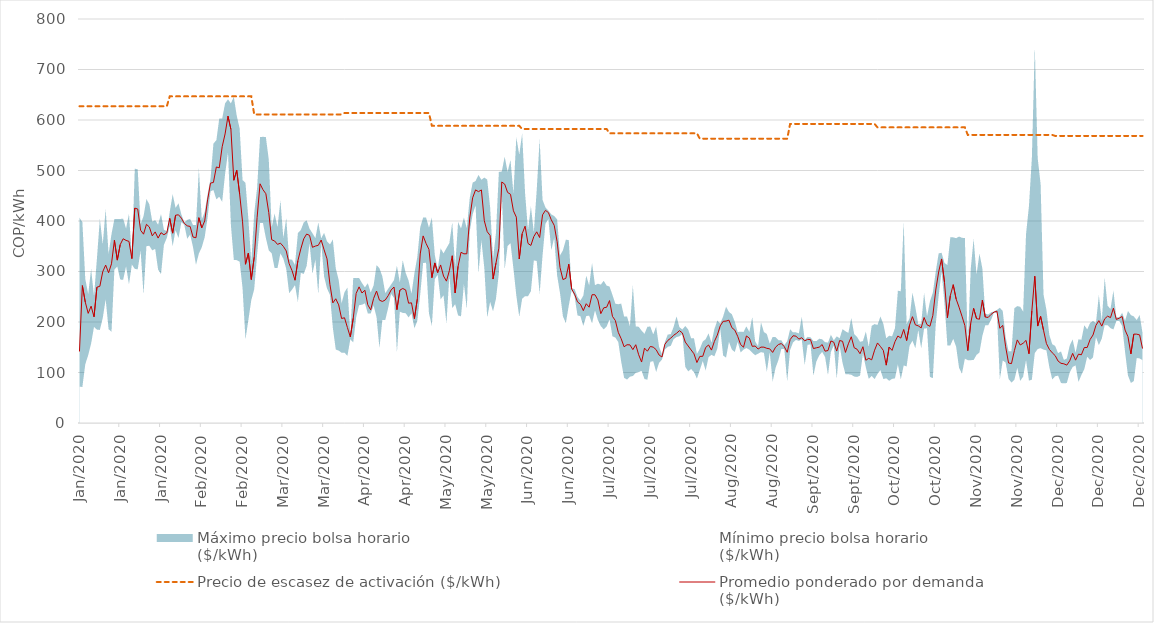
| Category | Precio de escasez de activación ($/kWh) | Promedio ponderado por demanda 
($/kWh) |
|---|---|---|
| 2020-01-01 | 627.213 | 141.655 |
| 2020-01-02 | 627.213 | 272.085 |
| 2020-01-03 | 627.213 | 239.373 |
| 2020-01-04 | 627.213 | 217.086 |
| 2020-01-05 | 627.213 | 231.37 |
| 2020-01-06 | 627.213 | 210.236 |
| 2020-01-07 | 627.213 | 268.882 |
| 2020-01-08 | 627.213 | 270.704 |
| 2020-01-09 | 627.213 | 299.661 |
| 2020-01-10 | 627.213 | 312.712 |
| 2020-01-11 | 627.213 | 297.516 |
| 2020-01-12 | 627.213 | 315.284 |
| 2020-01-13 | 627.213 | 361.729 |
| 2020-01-14 | 627.213 | 322.54 |
| 2020-01-15 | 627.213 | 353.299 |
| 2020-01-16 | 627.213 | 364.846 |
| 2020-01-17 | 627.213 | 361.555 |
| 2020-01-18 | 627.213 | 359.63 |
| 2020-01-19 | 627.213 | 325.527 |
| 2020-01-20 | 627.213 | 425.553 |
| 2020-01-21 | 627.213 | 423.751 |
| 2020-01-22 | 627.213 | 381.593 |
| 2020-01-23 | 627.213 | 373.913 |
| 2020-01-24 | 627.213 | 393.427 |
| 2020-01-25 | 627.213 | 388.112 |
| 2020-01-26 | 627.213 | 370.528 |
| 2020-01-27 | 627.213 | 378.386 |
| 2020-01-28 | 627.213 | 366.152 |
| 2020-01-29 | 627.213 | 376.867 |
| 2020-01-30 | 627.213 | 372.802 |
| 2020-01-31 | 627.213 | 376.49 |
| 2020-02-01 | 646.808 | 405.194 |
| 2020-02-02 | 646.808 | 375.973 |
| 2020-02-03 | 646.808 | 411.447 |
| 2020-02-04 | 646.808 | 412.305 |
| 2020-02-05 | 646.808 | 405.642 |
| 2020-02-06 | 646.808 | 395.253 |
| 2020-02-07 | 646.808 | 390.417 |
| 2020-02-08 | 646.808 | 389.23 |
| 2020-02-09 | 646.808 | 368.252 |
| 2020-02-10 | 646.808 | 366.878 |
| 2020-02-11 | 646.808 | 406.555 |
| 2020-02-12 | 646.808 | 386.313 |
| 2020-02-13 | 646.808 | 400.216 |
| 2020-02-14 | 646.808 | 441.826 |
| 2020-02-15 | 646.808 | 475.075 |
| 2020-02-16 | 646.808 | 476.331 |
| 2020-02-17 | 646.808 | 506.97 |
| 2020-02-18 | 646.808 | 505.279 |
| 2020-02-19 | 646.808 | 547.105 |
| 2020-02-20 | 646.808 | 572.398 |
| 2020-02-21 | 646.808 | 607.665 |
| 2020-02-22 | 646.808 | 581.477 |
| 2020-02-23 | 646.808 | 480.66 |
| 2020-02-24 | 646.808 | 500.383 |
| 2020-02-25 | 646.808 | 453.413 |
| 2020-02-26 | 646.808 | 398.446 |
| 2020-02-27 | 646.808 | 314.337 |
| 2020-02-28 | 646.808 | 336.603 |
| 2020-02-29 | 646.808 | 284.167 |
| 2020-03-01 | 610.972 | 328.336 |
| 2020-03-02 | 610.972 | 407.007 |
| 2020-03-03 | 610.972 | 473.69 |
| 2020-03-04 | 610.972 | 462.121 |
| 2020-03-05 | 610.972 | 453.989 |
| 2020-03-06 | 610.972 | 416.699 |
| 2020-03-07 | 610.972 | 362.888 |
| 2020-03-08 | 610.972 | 360.486 |
| 2020-03-09 | 610.972 | 353.698 |
| 2020-03-10 | 610.972 | 356.115 |
| 2020-03-11 | 610.972 | 349.742 |
| 2020-03-12 | 610.972 | 340.701 |
| 2020-03-13 | 610.972 | 315.329 |
| 2020-03-14 | 610.972 | 301.576 |
| 2020-03-15 | 610.972 | 282.792 |
| 2020-03-16 | 610.972 | 321.456 |
| 2020-03-17 | 610.972 | 344.68 |
| 2020-03-18 | 610.972 | 364.618 |
| 2020-03-19 | 610.972 | 374.156 |
| 2020-03-20 | 610.972 | 371.494 |
| 2020-03-21 | 610.972 | 347.905 |
| 2020-03-22 | 610.972 | 350.341 |
| 2020-03-23 | 610.972 | 351.836 |
| 2020-03-24 | 610.972 | 362.356 |
| 2020-03-25 | 610.972 | 342.828 |
| 2020-03-26 | 610.972 | 325.091 |
| 2020-03-27 | 610.972 | 274.595 |
| 2020-03-28 | 610.972 | 237.822 |
| 2020-03-29 | 610.972 | 245.986 |
| 2020-03-30 | 610.972 | 233.933 |
| 2020-03-31 | 610.972 | 206.991 |
| 2020-04-01 | 613.837 | 208.355 |
| 2020-04-02 | 613.837 | 189.05 |
| 2020-04-03 | 613.837 | 170.352 |
| 2020-04-04 | 613.837 | 207.409 |
| 2020-04-05 | 613.837 | 256.547 |
| 2020-04-06 | 613.837 | 269.583 |
| 2020-04-07 | 613.837 | 257.367 |
| 2020-04-08 | 613.837 | 262.926 |
| 2020-04-09 | 613.837 | 233.971 |
| 2020-04-10 | 613.837 | 224.045 |
| 2020-04-11 | 613.837 | 246.755 |
| 2020-04-12 | 613.837 | 261.29 |
| 2020-04-13 | 613.837 | 243.248 |
| 2020-04-14 | 613.837 | 240.67 |
| 2020-04-15 | 613.837 | 243.576 |
| 2020-04-16 | 613.837 | 252.107 |
| 2020-04-17 | 613.837 | 263.306 |
| 2020-04-18 | 613.837 | 269.279 |
| 2020-04-19 | 613.837 | 224.392 |
| 2020-04-20 | 613.837 | 262.994 |
| 2020-04-21 | 613.837 | 266.337 |
| 2020-04-22 | 613.837 | 263.512 |
| 2020-04-23 | 613.837 | 237.231 |
| 2020-04-24 | 613.837 | 237.94 |
| 2020-04-25 | 613.837 | 206.629 |
| 2020-04-26 | 613.837 | 245.4 |
| 2020-04-27 | 613.837 | 334.753 |
| 2020-04-28 | 613.837 | 370.512 |
| 2020-04-29 | 613.837 | 355.629 |
| 2020-04-30 | 613.837 | 343.69 |
| 2020-05-01 | 588.481 | 287.702 |
| 2020-05-02 | 588.481 | 316.971 |
| 2020-05-03 | 588.481 | 297.734 |
| 2020-05-04 | 588.481 | 312.993 |
| 2020-05-05 | 588.481 | 291.024 |
| 2020-05-06 | 588.481 | 280.888 |
| 2020-05-07 | 588.481 | 301.519 |
| 2020-05-08 | 588.481 | 331.157 |
| 2020-05-09 | 588.481 | 257.518 |
| 2020-05-10 | 588.481 | 310.347 |
| 2020-05-11 | 588.481 | 338.014 |
| 2020-05-12 | 588.481 | 334.973 |
| 2020-05-13 | 588.481 | 335.125 |
| 2020-05-14 | 588.481 | 405.9 |
| 2020-05-15 | 588.481 | 445.901 |
| 2020-05-16 | 588.481 | 461.627 |
| 2020-05-17 | 588.481 | 458.15 |
| 2020-05-18 | 588.481 | 461.49 |
| 2020-05-19 | 588.481 | 400.55 |
| 2020-05-20 | 588.481 | 378.798 |
| 2020-05-21 | 588.481 | 371.27 |
| 2020-05-22 | 588.481 | 285.071 |
| 2020-05-23 | 588.481 | 316.483 |
| 2020-05-24 | 588.481 | 346.121 |
| 2020-05-25 | 588.481 | 477.281 |
| 2020-05-26 | 588.481 | 473.023 |
| 2020-05-27 | 588.481 | 456.552 |
| 2020-05-28 | 588.481 | 452.903 |
| 2020-05-29 | 588.481 | 420.188 |
| 2020-05-30 | 588.481 | 407.624 |
| 2020-05-31 | 588.481 | 324.825 |
| 2020-06-01 | 582.191 | 374.86 |
| 2020-06-02 | 582.191 | 389.743 |
| 2020-06-03 | 582.191 | 355.543 |
| 2020-06-04 | 582.191 | 351.605 |
| 2020-06-05 | 582.191 | 369.216 |
| 2020-06-06 | 582.191 | 378.575 |
| 2020-06-07 | 582.191 | 367.258 |
| 2020-06-08 | 582.191 | 412.206 |
| 2020-06-09 | 582.191 | 421.041 |
| 2020-06-10 | 582.191 | 416.715 |
| 2020-06-11 | 582.191 | 402.321 |
| 2020-06-12 | 582.191 | 391.427 |
| 2020-06-13 | 582.191 | 359.245 |
| 2020-06-14 | 582.191 | 307.953 |
| 2020-06-15 | 582.191 | 284.039 |
| 2020-06-16 | 582.191 | 286.447 |
| 2020-06-17 | 582.191 | 314.437 |
| 2020-06-18 | 582.191 | 265.275 |
| 2020-06-19 | 582.191 | 255.146 |
| 2020-06-20 | 582.191 | 239.815 |
| 2020-06-21 | 582.191 | 235.059 |
| 2020-06-22 | 582.191 | 222.535 |
| 2020-06-23 | 582.191 | 236.18 |
| 2020-06-24 | 582.191 | 229.272 |
| 2020-06-25 | 582.191 | 254.037 |
| 2020-06-26 | 582.191 | 253.957 |
| 2020-06-27 | 582.191 | 243.68 |
| 2020-06-28 | 582.191 | 216.54 |
| 2020-06-29 | 582.191 | 228.038 |
| 2020-06-30 | 582.191 | 229.21 |
| 2020-07-01 | 573.611 | 242.416 |
| 2020-07-02 | 573.611 | 211.155 |
| 2020-07-03 | 573.611 | 202.792 |
| 2020-07-04 | 573.611 | 179.42 |
| 2020-07-05 | 573.611 | 166.772 |
| 2020-07-06 | 573.611 | 150.909 |
| 2020-07-07 | 573.611 | 154.98 |
| 2020-07-08 | 573.611 | 154.683 |
| 2020-07-09 | 573.611 | 145.281 |
| 2020-07-10 | 573.611 | 154.998 |
| 2020-07-11 | 573.611 | 135.186 |
| 2020-07-12 | 573.611 | 120.717 |
| 2020-07-13 | 573.611 | 148.25 |
| 2020-07-14 | 573.611 | 142.148 |
| 2020-07-15 | 573.611 | 151.556 |
| 2020-07-16 | 573.611 | 150.222 |
| 2020-07-17 | 573.611 | 145.23 |
| 2020-07-18 | 573.611 | 134.675 |
| 2020-07-19 | 573.611 | 130.675 |
| 2020-07-20 | 573.611 | 155.858 |
| 2020-07-21 | 573.611 | 163.495 |
| 2020-07-22 | 573.611 | 167.956 |
| 2020-07-23 | 573.611 | 173.707 |
| 2020-07-24 | 573.611 | 177.62 |
| 2020-07-25 | 573.611 | 182.864 |
| 2020-07-26 | 573.611 | 178.305 |
| 2020-07-27 | 573.611 | 160.288 |
| 2020-07-28 | 573.611 | 152.484 |
| 2020-07-29 | 573.611 | 144.704 |
| 2020-07-30 | 573.611 | 136.96 |
| 2020-07-31 | 573.611 | 119.77 |
| 2020-08-01 | 562.998 | 131.922 |
| 2020-08-02 | 562.998 | 131.994 |
| 2020-08-03 | 562.998 | 149.553 |
| 2020-08-04 | 562.998 | 154.463 |
| 2020-08-05 | 562.998 | 144.365 |
| 2020-08-06 | 562.998 | 161.59 |
| 2020-08-07 | 562.998 | 173.999 |
| 2020-08-08 | 562.998 | 192.289 |
| 2020-08-09 | 562.998 | 201.303 |
| 2020-08-10 | 562.998 | 201.823 |
| 2020-08-11 | 562.998 | 203.646 |
| 2020-08-12 | 562.998 | 188.768 |
| 2020-08-13 | 562.998 | 183.965 |
| 2020-08-14 | 562.998 | 171.624 |
| 2020-08-15 | 562.998 | 155.364 |
| 2020-08-16 | 562.998 | 150.102 |
| 2020-08-17 | 562.998 | 172.309 |
| 2020-08-18 | 562.998 | 168.126 |
| 2020-08-19 | 562.998 | 151.778 |
| 2020-08-20 | 562.998 | 152.448 |
| 2020-08-21 | 562.998 | 146.398 |
| 2020-08-22 | 562.998 | 150.332 |
| 2020-08-23 | 562.998 | 150.211 |
| 2020-08-24 | 562.998 | 147.894 |
| 2020-08-25 | 562.998 | 146.824 |
| 2020-08-26 | 562.998 | 139.753 |
| 2020-08-27 | 562.998 | 150.094 |
| 2020-08-28 | 562.998 | 155.472 |
| 2020-08-29 | 562.998 | 157.288 |
| 2020-08-30 | 562.998 | 151.128 |
| 2020-08-31 | 562.998 | 139.975 |
| 2020-09-01 | 592.158 | 165.173 |
| 2020-09-02 | 592.158 | 172.76 |
| 2020-09-03 | 592.158 | 172.022 |
| 2020-09-04 | 592.158 | 166.146 |
| 2020-09-05 | 592.158 | 168.898 |
| 2020-09-06 | 592.158 | 162.579 |
| 2020-09-07 | 592.158 | 165.64 |
| 2020-09-08 | 592.158 | 165.094 |
| 2020-09-09 | 592.158 | 147.406 |
| 2020-09-10 | 592.158 | 148.887 |
| 2020-09-11 | 592.158 | 150.225 |
| 2020-09-12 | 592.158 | 155.346 |
| 2020-09-13 | 592.158 | 142.25 |
| 2020-09-14 | 592.158 | 143.498 |
| 2020-09-15 | 592.158 | 162.431 |
| 2020-09-16 | 592.158 | 159.933 |
| 2020-09-17 | 592.158 | 142.45 |
| 2020-09-18 | 592.158 | 163.319 |
| 2020-09-19 | 592.158 | 161.79 |
| 2020-09-20 | 592.158 | 139.809 |
| 2020-09-21 | 592.158 | 156.838 |
| 2020-09-22 | 592.158 | 170.741 |
| 2020-09-23 | 592.158 | 149.021 |
| 2020-09-24 | 592.158 | 146.029 |
| 2020-09-25 | 592.158 | 137.19 |
| 2020-09-26 | 592.158 | 151.027 |
| 2020-09-27 | 592.158 | 124.276 |
| 2020-09-28 | 592.158 | 128.091 |
| 2020-09-29 | 592.158 | 125.1 |
| 2020-09-30 | 592.158 | 144.172 |
| 2020-10-01 | 585.407 | 158.534 |
| 2020-10-02 | 585.407 | 151.598 |
| 2020-10-03 | 585.407 | 143.692 |
| 2020-10-04 | 585.407 | 114.573 |
| 2020-10-05 | 585.407 | 150.449 |
| 2020-10-06 | 585.407 | 143.752 |
| 2020-10-07 | 585.407 | 161.067 |
| 2020-10-08 | 585.407 | 172.323 |
| 2020-10-09 | 585.407 | 168.148 |
| 2020-10-10 | 585.407 | 185.233 |
| 2020-10-11 | 585.407 | 163.294 |
| 2020-10-12 | 585.407 | 193.89 |
| 2020-10-13 | 585.407 | 210.545 |
| 2020-10-14 | 585.407 | 194.394 |
| 2020-10-15 | 585.407 | 192.357 |
| 2020-10-16 | 585.407 | 188.304 |
| 2020-10-17 | 585.407 | 208.923 |
| 2020-10-18 | 585.407 | 194.625 |
| 2020-10-19 | 585.407 | 191.428 |
| 2020-10-20 | 585.407 | 212.908 |
| 2020-10-21 | 585.407 | 263.282 |
| 2020-10-22 | 585.407 | 299.107 |
| 2020-10-23 | 585.407 | 324.857 |
| 2020-10-24 | 585.407 | 278.743 |
| 2020-10-25 | 585.407 | 208.203 |
| 2020-10-26 | 585.407 | 252.256 |
| 2020-10-27 | 585.407 | 273.918 |
| 2020-10-28 | 585.407 | 245.468 |
| 2020-10-29 | 585.407 | 229.303 |
| 2020-10-30 | 585.407 | 211.528 |
| 2020-10-31 | 585.407 | 192.872 |
| 2020-11-01 | 570.461 | 143.221 |
| 2020-11-02 | 570.461 | 197.207 |
| 2020-11-03 | 570.461 | 226.999 |
| 2020-11-04 | 570.461 | 206.735 |
| 2020-11-05 | 570.461 | 205.478 |
| 2020-11-06 | 570.461 | 243.317 |
| 2020-11-07 | 570.461 | 209.736 |
| 2020-11-08 | 570.461 | 209.039 |
| 2020-11-09 | 570.461 | 215.102 |
| 2020-11-10 | 570.461 | 219.543 |
| 2020-11-11 | 570.461 | 221.435 |
| 2020-11-12 | 570.461 | 187.494 |
| 2020-11-13 | 570.461 | 193.212 |
| 2020-11-14 | 570.461 | 150.893 |
| 2020-11-15 | 570.461 | 118.771 |
| 2020-11-16 | 570.461 | 117.601 |
| 2020-11-17 | 570.461 | 143.469 |
| 2020-11-18 | 570.461 | 164.564 |
| 2020-11-19 | 570.461 | 154.51 |
| 2020-11-20 | 570.461 | 157.898 |
| 2020-11-21 | 570.461 | 163.599 |
| 2020-11-22 | 570.461 | 137.159 |
| 2020-11-23 | 570.461 | 222.142 |
| 2020-11-24 | 570.461 | 290.626 |
| 2020-11-25 | 570.461 | 191.964 |
| 2020-11-26 | 570.461 | 211.193 |
| 2020-11-27 | 570.461 | 183.664 |
| 2020-11-28 | 570.461 | 157.33 |
| 2020-11-29 | 570.461 | 145.862 |
| 2020-11-30 | 570.461 | 138.999 |
| 2020-12-01 | 568.457 | 133.473 |
| 2020-12-02 | 568.457 | 122.619 |
| 2020-12-03 | 568.457 | 118.224 |
| 2020-12-04 | 568.457 | 117.196 |
| 2020-12-05 | 568.457 | 114.599 |
| 2020-12-06 | 568.457 | 123.169 |
| 2020-12-07 | 568.457 | 137.858 |
| 2020-12-08 | 568.457 | 124.434 |
| 2020-12-09 | 568.457 | 136.315 |
| 2020-12-10 | 568.457 | 135.093 |
| 2020-12-11 | 568.457 | 149.425 |
| 2020-12-12 | 568.457 | 149.621 |
| 2020-12-13 | 568.457 | 165.367 |
| 2020-12-14 | 568.457 | 174.296 |
| 2020-12-15 | 568.457 | 193.354 |
| 2020-12-16 | 568.457 | 202.675 |
| 2020-12-17 | 568.457 | 191.815 |
| 2020-12-18 | 568.457 | 206.241 |
| 2020-12-19 | 568.457 | 211.532 |
| 2020-12-20 | 568.457 | 208.677 |
| 2020-12-21 | 568.457 | 227.409 |
| 2020-12-22 | 568.457 | 205.114 |
| 2020-12-23 | 568.457 | 207.6 |
| 2020-12-24 | 568.457 | 210.96 |
| 2020-12-25 | 568.457 | 184.037 |
| 2020-12-26 | 568.457 | 170.978 |
| 2020-12-27 | 568.457 | 136.828 |
| 2020-12-28 | 568.457 | 176.023 |
| 2020-12-29 | 568.457 | 175.902 |
| 2020-12-30 | 568.457 | 174.451 |
| 2020-12-31 | 568.457 | 147.474 |